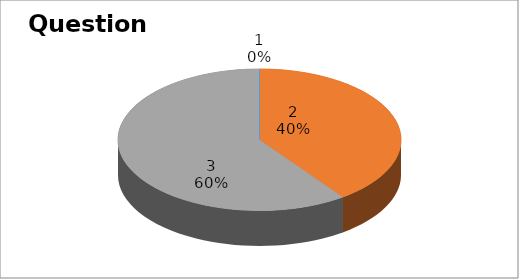
| Category | Series 0 |
|---|---|
| 0 | 0 |
| 1 | 8 |
| 2 | 12 |